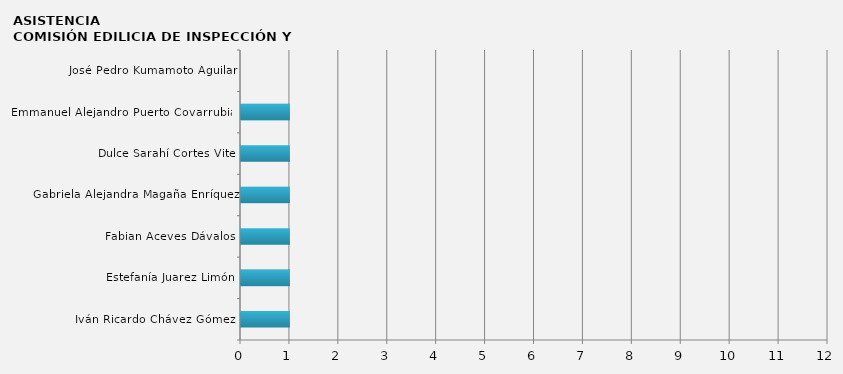
| Category | Iván Ricardo Chávez Gómez  |
|---|---|
| Iván Ricardo Chávez Gómez  | 1 |
| Estefanía Juarez Limón | 1 |
| Fabian Aceves Dávalos | 1 |
| Gabriela Alejandra Magaña Enríquez | 1 |
| Dulce Sarahí Cortes Vite | 1 |
| Emmanuel Alejandro Puerto Covarrubias | 1 |
| José Pedro Kumamoto Aguilar | 0 |